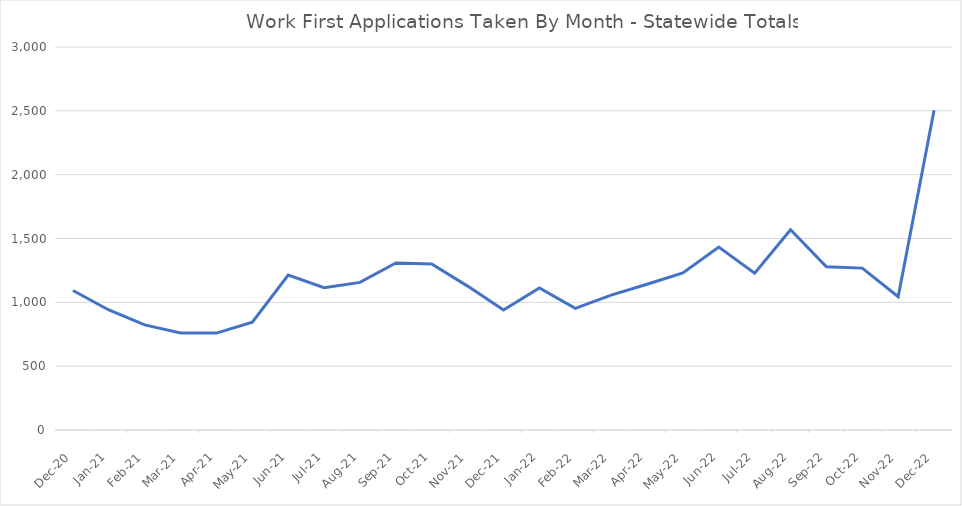
| Category | Series 0 |
|---|---|
| 2022-12-01 | 2505 |
| 2022-11-22 | 1044 |
| 2022-10-22 | 1268 |
| 2022-09-22 | 1279 |
| 2022-08-22 | 1568 |
| 2022-07-22 | 1228 |
| 2022-06-01 | 1433 |
| 2022-05-01 | 1230 |
| 2022-04-01 | 1142 |
| 2022-03-01 | 1056 |
| 2022-02-01 | 953 |
| 2022-01-01 | 1113 |
| 2021-12-02 | 940 |
| 2021-11-01 | 1127 |
| 2021-10-01 | 1301 |
| 2021-09-01 | 1308 |
| 2021-08-01 | 1156 |
| 2021-07-01 | 1115 |
| 2021-06-01 | 1214 |
| 2021-05-01 | 845 |
| 2021-04-01 | 759 |
| 2021-03-01 | 760 |
| 2021-02-01 | 823 |
| 2021-01-01 | 940 |
| 2020-12-01 | 1093 |